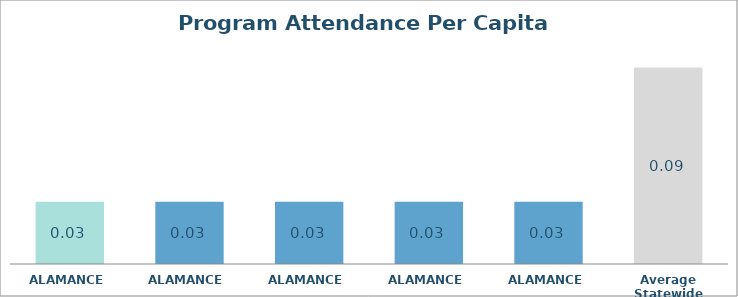
| Category | Series 0 |
|---|---|
| ALAMANCE  | 0.028 |
| ALAMANCE  | 0.028 |
| ALAMANCE  | 0.028 |
| ALAMANCE  | 0.028 |
| ALAMANCE  | 0.028 |
| Average Statewide | 0.089 |